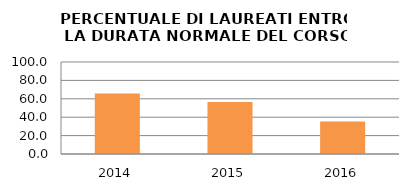
| Category | 2014 2015 2016 |
|---|---|
| 2014.0 | 65.854 |
| 2015.0 | 56.41 |
| 2016.0 | 35.433 |